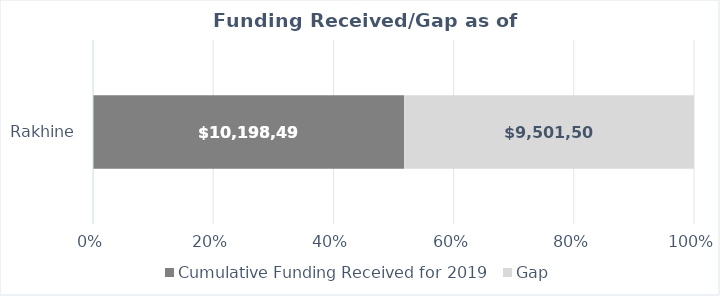
| Category | Cumulative Funding Received for 2019 | Gap |
|---|---|---|
| Rakhine | 10198493.823 | 9501506.177 |